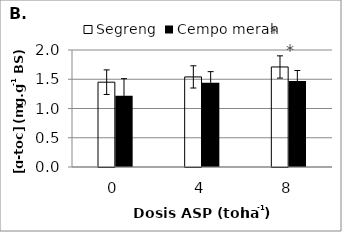
| Category | Segreng | Cempo merah |
|---|---|---|
| 0 | 1.45 | 1.22 |
| 1 | 1.54 | 1.44 |
| 2 | 1.71 | 1.47 |